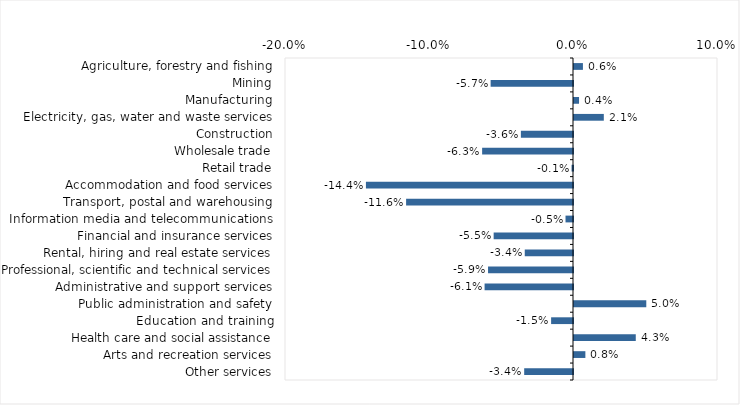
| Category | This week |
|---|---|
| Agriculture, forestry and fishing | 0.006 |
| Mining | -0.057 |
| Manufacturing | 0.004 |
| Electricity, gas, water and waste services | 0.021 |
| Construction | -0.036 |
| Wholesale trade | -0.063 |
| Retail trade | -0.001 |
| Accommodation and food services | -0.144 |
| Transport, postal and warehousing | -0.116 |
| Information media and telecommunications | -0.005 |
| Financial and insurance services | -0.055 |
| Rental, hiring and real estate services | -0.034 |
| Professional, scientific and technical services | -0.059 |
| Administrative and support services | -0.061 |
| Public administration and safety | 0.05 |
| Education and training | -0.015 |
| Health care and social assistance | 0.043 |
| Arts and recreation services | 0.008 |
| Other services | -0.034 |